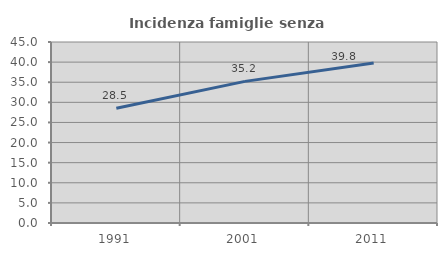
| Category | Incidenza famiglie senza nuclei |
|---|---|
| 1991.0 | 28.539 |
| 2001.0 | 35.214 |
| 2011.0 | 39.755 |